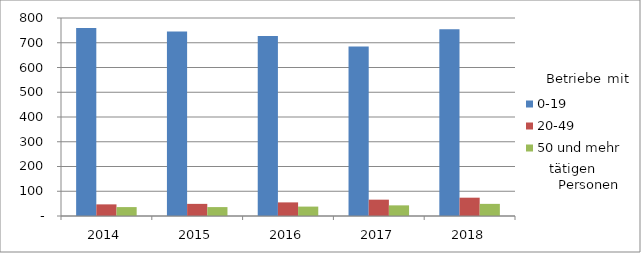
| Category | 0-19 | 20-49 | 50 und mehr |
|---|---|---|---|
| 2014.0 | 760 | 47 | 36 |
| 2015.0 | 745 | 49 | 36 |
| 2016.0 | 727 | 55 | 38 |
| 2017.0 | 685 | 66 | 43 |
| 2018.0 | 755 | 74 | 49 |